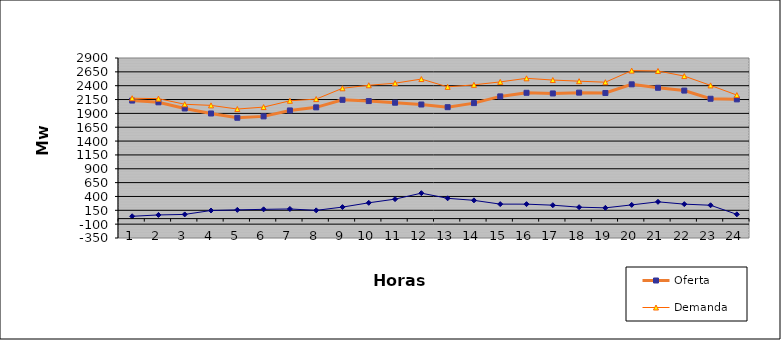
| Category | Oferta | Demanda | No Servida |
|---|---|---|---|
| 1.0 | 2131.27 | 2173.432 | 42.162 |
| 2.0 | 2099.84 | 2166.237 | 66.397 |
| 3.0 | 1988.89 | 2064.834 | 75.944 |
| 4.0 | 1897.92 | 2044.381 | 146.461 |
| 5.0 | 1820.85 | 1978.466 | 157.616 |
| 6.0 | 1845.94 | 2013.55 | 167.61 |
| 7.0 | 1953.1 | 2127.428 | 174.328 |
| 8.0 | 2009.07 | 2158.263 | 149.193 |
| 9.0 | 2144.95 | 2353.243 | 208.293 |
| 10.0 | 2122.33 | 2407.77 | 285.44 |
| 11.0 | 2092.76 | 2444.794 | 352.034 |
| 12.0 | 2060.22 | 2519.841 | 459.621 |
| 13.0 | 2011.91 | 2378.573 | 366.663 |
| 14.0 | 2085.4 | 2415.281 | 329.881 |
| 15.0 | 2206.81 | 2468.486 | 261.676 |
| 16.0 | 2271.88 | 2533.225 | 261.345 |
| 17.0 | 2260 | 2502.178 | 242.178 |
| 18.0 | 2274.71 | 2481.172 | 206.462 |
| 19.0 | 2268.4 | 2462.827 | 194.427 |
| 20.0 | 2424.62 | 2672.192 | 247.572 |
| 21.0 | 2362.46 | 2665.685 | 303.225 |
| 22.0 | 2311.7 | 2573.196 | 261.496 |
| 23.0 | 2163.96 | 2405.243 | 241.283 |
| 24.0 | 2153.16 | 2230.41 | 77.25 |